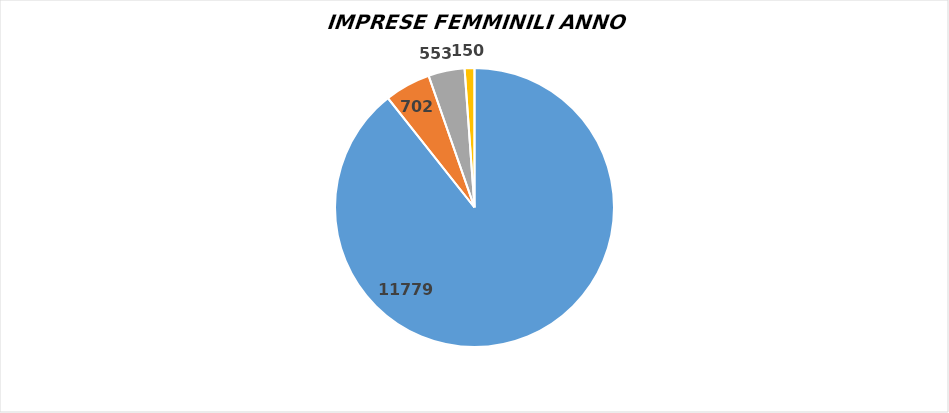
| Category | 14786 |
|---|---|
| 0 | 11779 |
| 1 | 702 |
| 2 | 553 |
| 3 | 150 |